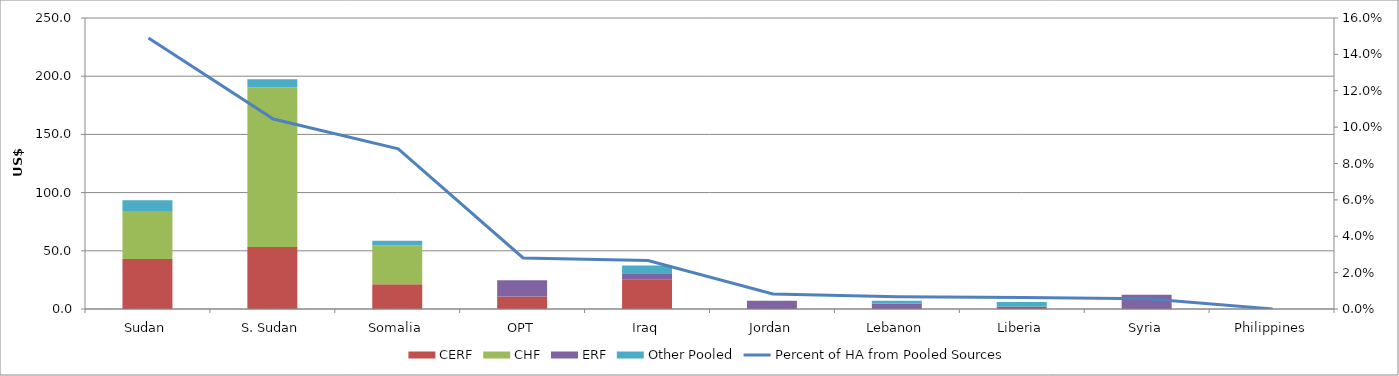
| Category | CERF | CHF | ERF | Other Pooled |
|---|---|---|---|---|
| Sudan | 42.965 | 41.304 | 0 | 9.208 |
| S. Sudan | 53.355 | 137.065 | 0 | 6.926 |
| Somalia | 21.318 | 33.548 | 0 | 3.772 |
| OPT | 10.761 | 0 | 13.847 | 0.077 |
| Iraq | 25.524 | 0 | 5.216 | 6.609 |
| Jordan | 0 | 0 | 7.093 | 0 |
| Lebanon | 0 | 0 | 4.783 | 2.306 |
| Liberia | 1.896 | 0 | 0 | 4.205 |
| Syria | 0 | 0 | 12.338 | 0 |
| Philippines | 0 | 0 | 0 | 0.012 |